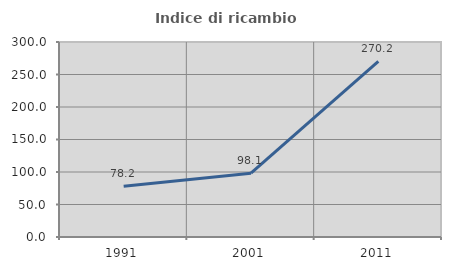
| Category | Indice di ricambio occupazionale  |
|---|---|
| 1991.0 | 78.171 |
| 2001.0 | 98.099 |
| 2011.0 | 270.175 |